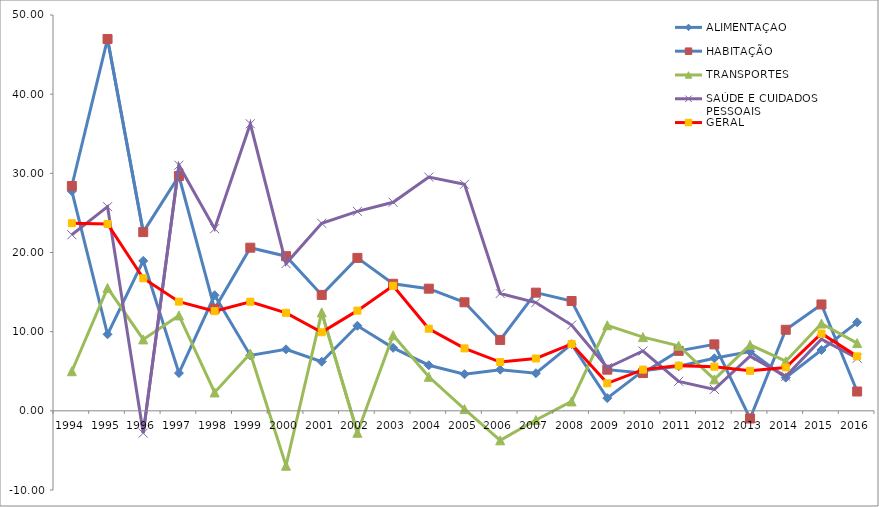
| Category | ALIMENTAÇÃO | HABITAÇÃO | TRANSPORTES | SAÚDE E CUIDADOS PESSOAIS | GERAL |
|---|---|---|---|---|---|
| 1994.0 | 27.749 | 28.401 | 5 | 22.245 | 23.699 |
| 1995.0 | 9.667 | 46.972 | 15.526 | 25.788 | 23.605 |
| 1996.0 | 18.941 | 22.575 | 9.023 | -2.812 | 16.746 |
| 1997.0 | 4.77 | 29.66 | 12.05 | 31.028 | 13.789 |
| 1998.0 | 14.599 | 12.88 | 2.323 | 23.007 | 12.588 |
| 1999.0 | 7 | 20.607 | 7.239 | 36.261 | 13.78 |
| 2000.0 | 7.767 | 19.535 | -6.93 | 18.604 | 12.381 |
| 2001.0 | 6.204 | 14.642 | 12.437 | 23.687 | 9.925 |
| 2002.0 | 10.742 | 19.317 | -2.77 | 25.196 | 12.654 |
| 2003.0 | 7.956 | 16.048 | 9.549 | 26.342 | 15.794 |
| 2004.0 | 5.762 | 15.431 | 4.296 | 29.526 | 10.371 |
| 2005.0 | 4.628 | 13.712 | 0.221 | 28.615 | 7.888 |
| 2006.0 | 5.195 | 8.955 | -3.728 | 14.82 | 6.162 |
| 2007.0 | 4.748 | 14.927 | -1.161 | 13.681 | 6.61 |
| 2008.0 | 8.425 | 13.873 | 1.189 | 10.833 | 8.445 |
| 2009.0 | 1.605 | 5.2 | 10.809 | 5.444 | 3.473 |
| 2010.0 | 5.049 | 4.77 | 9.312 | 7.557 | 5.208 |
| 2011.0 | 5.637 | 7.573 | 8.221 | 3.725 | 5.71 |
| 2012.0 | 6.632 | 8.395 | 3.975 | 2.708 | 5.577 |
| 2013.0 | 7.49 | -0.965 | 8.335 | 6.899 | 5.052 |
| 2014.0 | 4.188 | 10.238 | 6.267 | 4.35 | 5.478 |
| 2015.0 | 7.685 | 13.437 | 11.026 | 9.054 | 9.767 |
| 2016.0 | 11.179 | 2.442 | 8.558 | 6.643 | 6.879 |